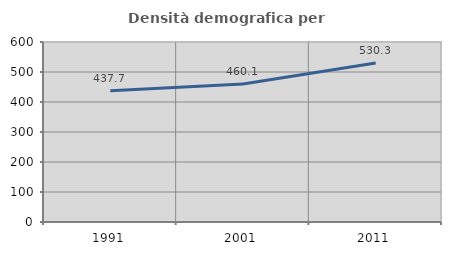
| Category | Densità demografica |
|---|---|
| 1991.0 | 437.657 |
| 2001.0 | 460.066 |
| 2011.0 | 530.334 |